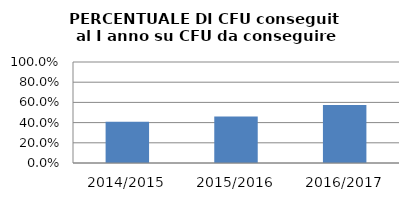
| Category | 2014/2015 2015/2016 2016/2017 |
|---|---|
| 2014/2015 | 0.408 |
| 2015/2016 | 0.46 |
| 2016/2017 | 0.575 |